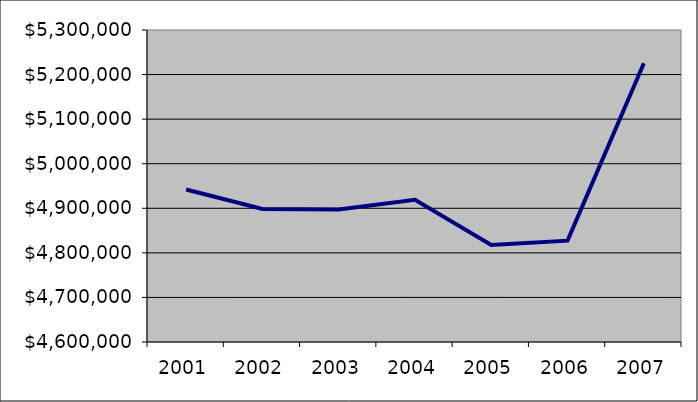
| Category | Aggregate Transmission Depreciation |
|---|---|
| 2001.0 | 4942006.339 |
| 2002.0 | 4898599.575 |
| 2003.0 | 4897288.689 |
| 2004.0 | 4919240.465 |
| 2005.0 | 4817626.04 |
| 2006.0 | 4827446.73 |
| 2007.0 | 5225492.807 |